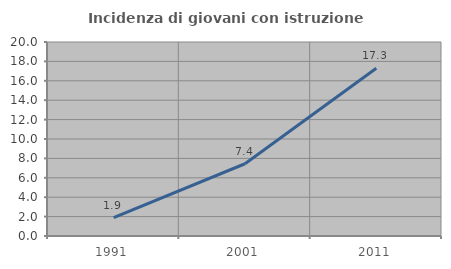
| Category | Incidenza di giovani con istruzione universitaria |
|---|---|
| 1991.0 | 1.893 |
| 2001.0 | 7.449 |
| 2011.0 | 17.293 |